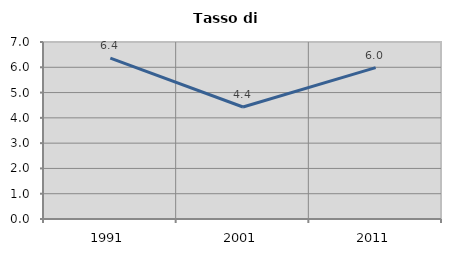
| Category | Tasso di disoccupazione   |
|---|---|
| 1991.0 | 6.36 |
| 2001.0 | 4.43 |
| 2011.0 | 5.987 |